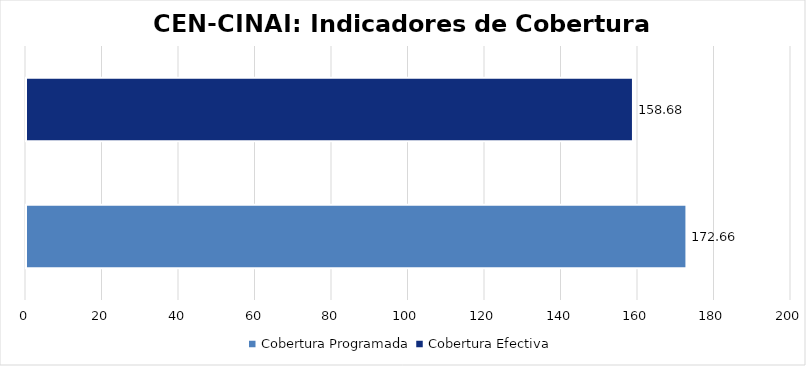
| Category | Total programa |
|---|---|
| Cobertura Programada | 172.657 |
| Cobertura Efectiva | 158.68 |